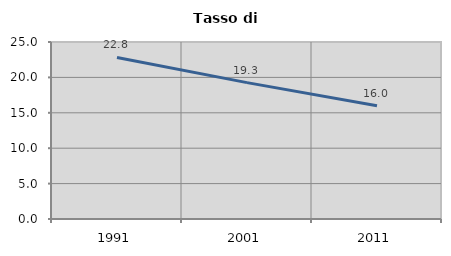
| Category | Tasso di disoccupazione   |
|---|---|
| 1991.0 | 22.812 |
| 2001.0 | 19.264 |
| 2011.0 | 15.996 |